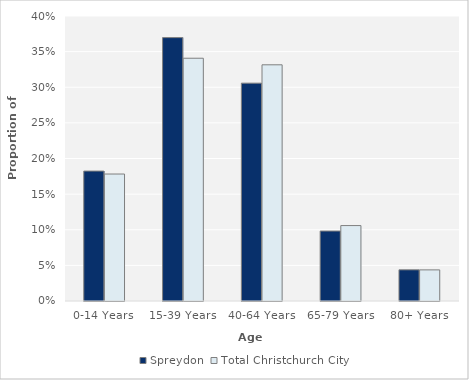
| Category | Spreydon | Total Christchurch City |
|---|---|---|
| 0-14 Years | 0.182 | 0.178 |
| 15-39 Years | 0.37 | 0.341 |
| 40-64 Years | 0.306 | 0.331 |
| 65-79 Years | 0.098 | 0.106 |
| 80+ Years | 0.044 | 0.044 |